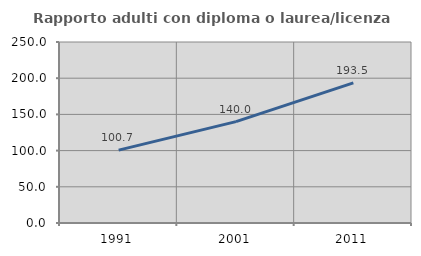
| Category | Rapporto adulti con diploma o laurea/licenza media  |
|---|---|
| 1991.0 | 100.664 |
| 2001.0 | 140.038 |
| 2011.0 | 193.506 |